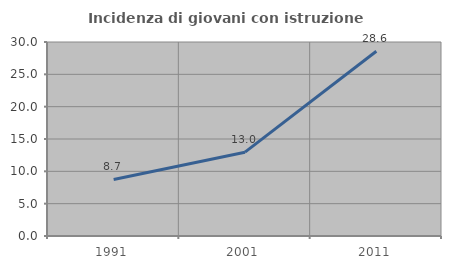
| Category | Incidenza di giovani con istruzione universitaria |
|---|---|
| 1991.0 | 8.738 |
| 2001.0 | 12.963 |
| 2011.0 | 28.571 |